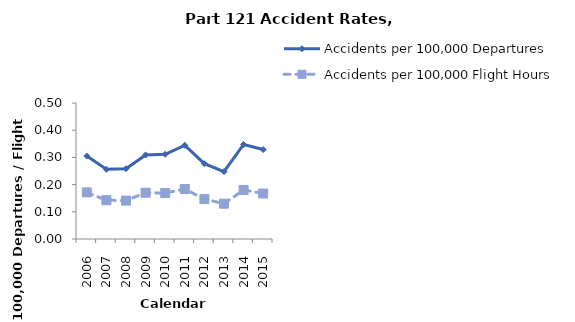
| Category | Accidents per 100,000 Departures | Accidents per 100,000 Flight Hours |
|---|---|---|
| 2006.0 | 0.305 | 0.171 |
| 2007.0 | 0.256 | 0.143 |
| 2008.0 | 0.258 | 0.141 |
| 2009.0 | 0.309 | 0.17 |
| 2010.0 | 0.311 | 0.169 |
| 2011.0 | 0.344 | 0.184 |
| 2012.0 | 0.277 | 0.147 |
| 2013.0 | 0.248 | 0.13 |
| 2014.0 | 0.348 | 0.18 |
| 2015.0 | 0.329 | 0.167 |